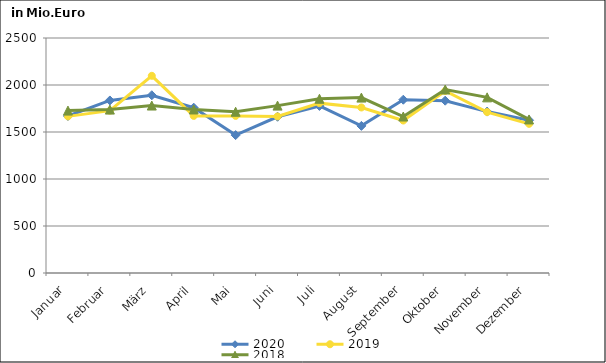
| Category | 2020 | 2019 | 2018 |
|---|---|---|---|
| Januar | 1670.357 | 1666.141 | 1727.684 |
| Februar | 1835.551 | 1727.37 | 1738.473 |
| März | 1890.927 | 2097.776 | 1781.436 |
| April | 1758.64 | 1671.512 | 1739.573 |
| Mai | 1466.775 | 1671.483 | 1715.38 |
| Juni | 1662.047 | 1665.741 | 1780.701 |
| Juli | 1777.14 | 1807.037 | 1853.648 |
| August | 1565.145 | 1761.02 | 1865.997 |
| September | 1843.296 | 1622.191 | 1664.581 |
| Oktober | 1833.027 | 1936.508 | 1952.346 |
| November | 1717.248 | 1711.943 | 1868.402 |
| Dezember | 1625.316 | 1586.939 | 1633.549 |